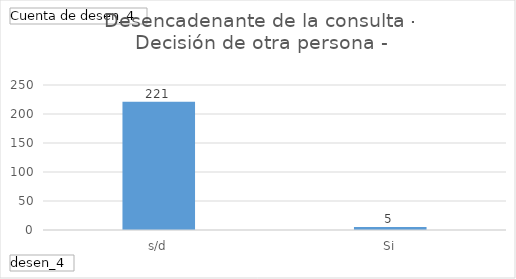
| Category | Total |
|---|---|
| s/d | 221 |
| Si | 5 |